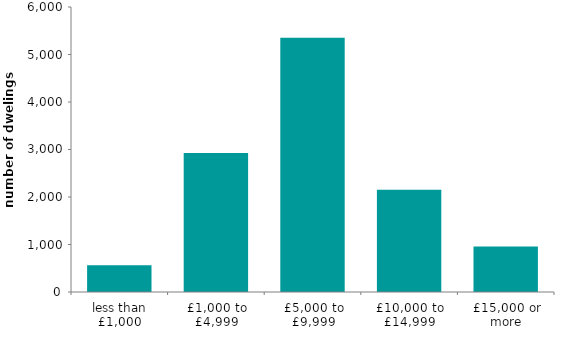
| Category | Series 0 |
|---|---|
| less than £1,000 | 560.847 |
| £1,000 to £4,999 | 2926.6 |
| £5,000 to £9,999 | 5350.799 |
| £10,000 to £14,999 | 2153.048 |
| £15,000 or more | 955.638 |